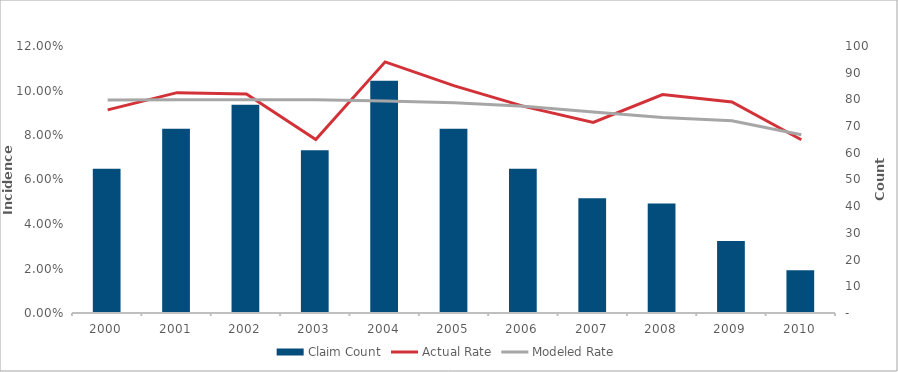
| Category | Claim Count |
|---|---|
| 2000.0 | 54 |
| 2001.0 | 69 |
| 2002.0 | 78 |
| 2003.0 | 61 |
| 2004.0 | 87 |
| 2005.0 | 69 |
| 2006.0 | 54 |
| 2007.0 | 43 |
| 2008.0 | 41 |
| 2009.0 | 27 |
| 2010.0 | 16 |